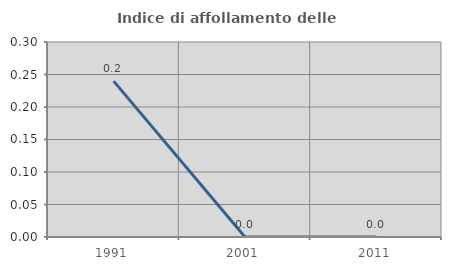
| Category | Indice di affollamento delle abitazioni  |
|---|---|
| 1991.0 | 0.24 |
| 2001.0 | 0 |
| 2011.0 | 0 |